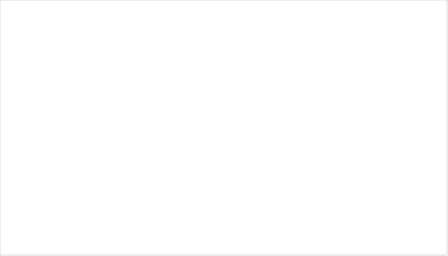
| Category | Total |
|---|---|
| Underviser | 77 |